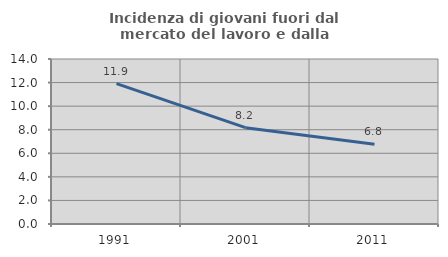
| Category | Incidenza di giovani fuori dal mercato del lavoro e dalla formazione  |
|---|---|
| 1991.0 | 11.916 |
| 2001.0 | 8.171 |
| 2011.0 | 6.773 |